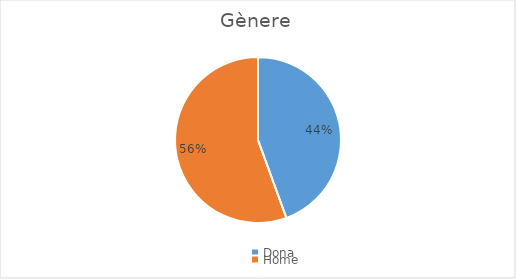
| Category | Series 0 |
|---|---|
| Dona | 4 |
| Home | 5 |